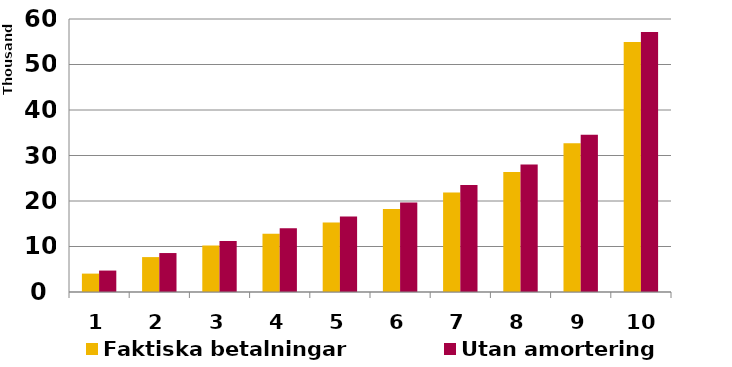
| Category | Faktiska betalningar | Utan amortering |
|---|---|---|
| 1.0 | 4039.899 | 4709.986 |
| 2.0 | 7670.085 | 8561.191 |
| 3.0 | 10216.005 | 11228.846 |
| 4.0 | 12795.173 | 13987.009 |
| 5.0 | 15281.214 | 16583.597 |
| 6.0 | 18268.749 | 19685.361 |
| 7.0 | 21866.984 | 23493.41 |
| 8.0 | 26371.64 | 28033.056 |
| 9.0 | 32677.584 | 34549.714 |
| 10.0 | 54959.759 | 57130.431 |